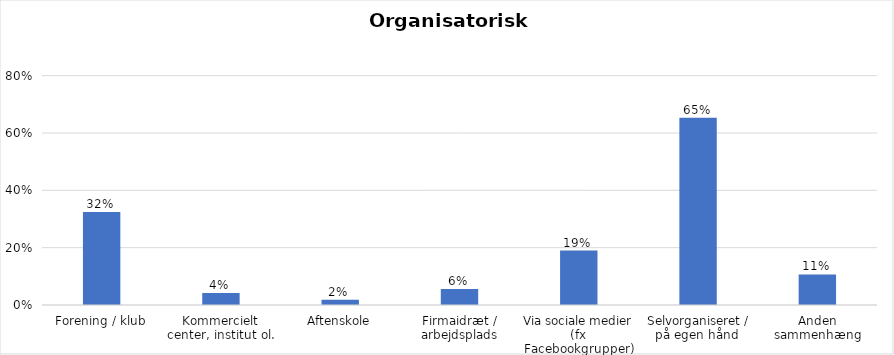
| Category | % |
|---|---|
| Forening / klub | 0.324 |
| Kommercielt center, institut ol. | 0.042 |
| Aftenskole | 0.019 |
| Firmaidræt / arbejdsplads | 0.056 |
| Via sociale medier (fx Facebookgrupper) | 0.19 |
| Selvorganiseret / på egen hånd  | 0.653 |
| Anden sammenhæng | 0.106 |